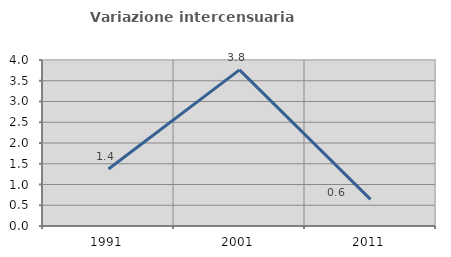
| Category | Variazione intercensuaria annua |
|---|---|
| 1991.0 | 1.375 |
| 2001.0 | 3.763 |
| 2011.0 | 0.643 |